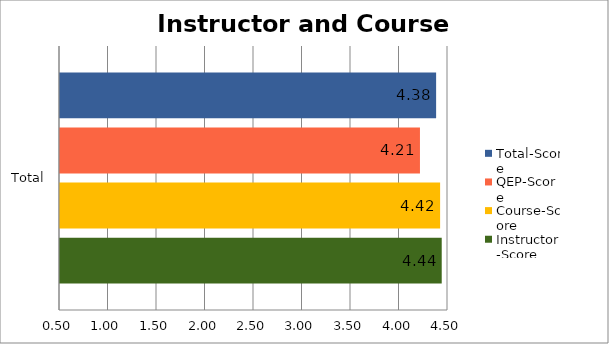
| Category | Instructor-Score | Course-Score | QEP-Score | Total-Score |
|---|---|---|---|---|
| Total | 4.435 | 4.419 | 4.211 | 4.378 |